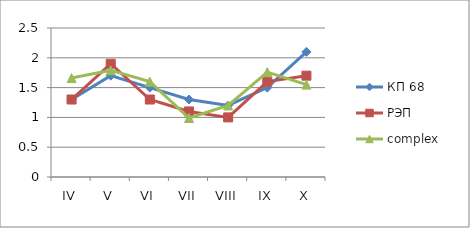
| Category | КП 68 | РЭП  | complex |
|---|---|---|---|
| IV | 1.3 | 1.3 | 1.66 |
| V | 1.7 | 1.9 | 1.79 |
| VI | 1.5 | 1.3 | 1.6 |
| VII | 1.3 | 1.1 | 0.99 |
| VIII | 1.2 | 1 | 1.2 |
| IX | 1.5 | 1.6 | 1.76 |
| X | 2.1 | 1.7 | 1.55 |